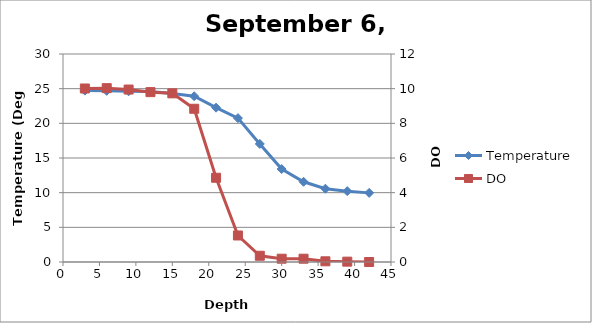
| Category | Temperature |
|---|---|
| 3.0 | 24.72 |
| 6.0 | 24.69 |
| 9.0 | 24.62 |
| 12.0 | 24.58 |
| 15.0 | 24.31 |
| 18.0 | 23.91 |
| 21.0 | 22.26 |
| 24.0 | 20.75 |
| 27.0 | 17.03 |
| 30.0 | 13.41 |
| 33.0 | 11.57 |
| 36.0 | 10.57 |
| 39.0 | 10.22 |
| 42.0 | 9.97 |